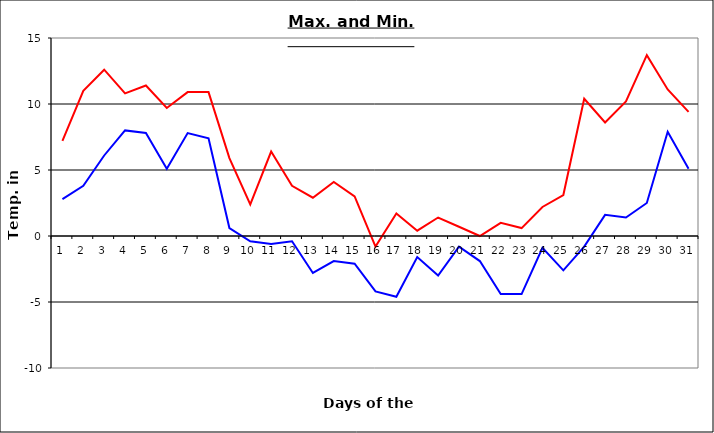
| Category | Series 0 | Series 1 |
|---|---|---|
| 0 | 7.2 | 2.8 |
| 1 | 11 | 3.8 |
| 2 | 12.6 | 6.1 |
| 3 | 10.8 | 8 |
| 4 | 11.4 | 7.8 |
| 5 | 9.7 | 5.1 |
| 6 | 10.9 | 7.8 |
| 7 | 10.9 | 7.4 |
| 8 | 5.9 | 0.6 |
| 9 | 2.4 | -0.4 |
| 10 | 6.4 | -0.6 |
| 11 | 3.8 | -0.4 |
| 12 | 2.9 | -2.8 |
| 13 | 4.1 | -1.9 |
| 14 | 3 | -2.1 |
| 15 | -0.8 | -4.2 |
| 16 | 1.7 | -4.6 |
| 17 | 0.4 | -1.6 |
| 18 | 1.4 | -3 |
| 19 | 0.7 | -0.8 |
| 20 | 0 | -1.9 |
| 21 | 1 | -4.4 |
| 22 | 0.6 | -4.4 |
| 23 | 2.2 | -0.9 |
| 24 | 3.1 | -2.6 |
| 25 | 10.4 | -0.8 |
| 26 | 8.6 | 1.6 |
| 27 | 10.2 | 1.4 |
| 28 | 13.7 | 2.5 |
| 29 | 11.1 | 7.9 |
| 30 | 9.4 | 5.1 |